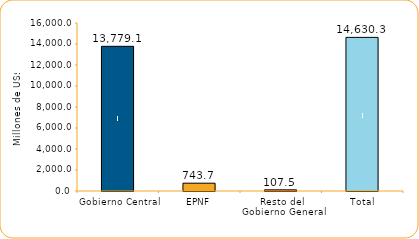
| Category | Series 1 |
|---|---|
| Gobierno Central | 13779.1 |
| EPNF | 743.7 |
| Resto del Gobierno General | 107.5 |
| Total | 14630.3 |